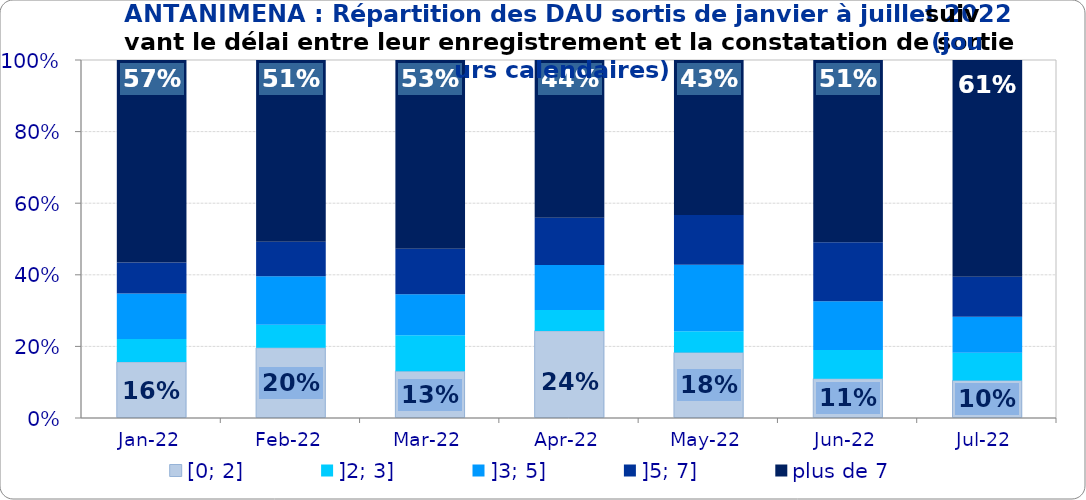
| Category | [0; 2] | ]2; 3] | ]3; 5] | ]5; 7] | plus de 7 |
|---|---|---|---|---|---|
| 2022-01-01 | 0.157 | 0.064 | 0.127 | 0.087 | 0.566 |
| 2022-02-01 | 0.196 | 0.065 | 0.136 | 0.096 | 0.508 |
| 2022-03-01 | 0.131 | 0.1 | 0.115 | 0.127 | 0.527 |
| 2022-04-01 | 0.243 | 0.058 | 0.126 | 0.132 | 0.441 |
| 2022-05-01 | 0.183 | 0.059 | 0.186 | 0.139 | 0.433 |
| 2022-06-01 | 0.11 | 0.08 | 0.136 | 0.165 | 0.509 |
| 2022-07-01 | 0.105 | 0.077 | 0.101 | 0.112 | 0.606 |